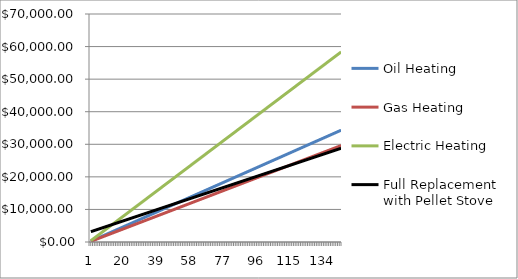
| Category | Oil Heating | Gas Heating | Electric Heating | Full Replacement with Pellet Stove |
|---|---|---|---|---|
| 0 | 240.01 | 207.04 | 408.04 | 3180.33 |
| 1 | 480.02 | 414.08 | 816.08 | 3360.66 |
| 2 | 720.03 | 621.12 | 1224.12 | 3540.99 |
| 3 | 960.04 | 828.16 | 1632.16 | 3721.32 |
| 4 | 1200.05 | 1035.2 | 2040.2 | 3901.65 |
| 5 | 1440.06 | 1242.24 | 2448.24 | 4081.98 |
| 6 | 1680.07 | 1449.28 | 2856.28 | 4262.31 |
| 7 | 1920.08 | 1656.32 | 3264.32 | 4442.64 |
| 8 | 2160.09 | 1863.36 | 3672.36 | 4622.97 |
| 9 | 2400.1 | 2070.4 | 4080.4 | 4803.3 |
| 10 | 2640.11 | 2277.44 | 4488.44 | 4983.63 |
| 11 | 2880.12 | 2484.48 | 4896.48 | 5163.96 |
| 12 | 3120.13 | 2691.52 | 5304.52 | 5344.29 |
| 13 | 3360.14 | 2898.56 | 5712.56 | 5524.62 |
| 14 | 3600.15 | 3105.6 | 6120.6 | 5704.95 |
| 15 | 3840.16 | 3312.64 | 6528.64 | 5885.28 |
| 16 | 4080.17 | 3519.68 | 6936.68 | 6065.61 |
| 17 | 4320.18 | 3726.72 | 7344.72 | 6245.94 |
| 18 | 4560.19 | 3933.76 | 7752.76 | 6426.27 |
| 19 | 4800.2 | 4140.8 | 8160.8 | 6606.6 |
| 20 | 5040.21 | 4347.84 | 8568.84 | 6786.93 |
| 21 | 5280.22 | 4554.88 | 8976.88 | 6967.26 |
| 22 | 5520.23 | 4761.92 | 9384.92 | 7147.59 |
| 23 | 5760.24 | 4968.96 | 9792.96 | 7327.92 |
| 24 | 6000.25 | 5176 | 10201 | 7508.25 |
| 25 | 6240.26 | 5383.04 | 10609.04 | 7688.58 |
| 26 | 6480.27 | 5590.08 | 11017.08 | 7868.91 |
| 27 | 6720.28 | 5797.12 | 11425.12 | 8049.24 |
| 28 | 6960.29 | 6004.16 | 11833.16 | 8229.57 |
| 29 | 7200.3 | 6211.2 | 12241.2 | 8409.9 |
| 30 | 7440.31 | 6418.24 | 12649.24 | 8590.23 |
| 31 | 7680.32 | 6625.28 | 13057.28 | 8770.56 |
| 32 | 7920.33 | 6832.32 | 13465.32 | 8950.89 |
| 33 | 8160.34 | 7039.36 | 13873.36 | 9131.22 |
| 34 | 8400.35 | 7246.4 | 14281.4 | 9311.55 |
| 35 | 8640.36 | 7453.44 | 14689.44 | 9491.88 |
| 36 | 8880.37 | 7660.48 | 15097.48 | 9672.21 |
| 37 | 9120.38 | 7867.52 | 15505.52 | 9852.54 |
| 38 | 9360.39 | 8074.56 | 15913.56 | 10032.87 |
| 39 | 9600.4 | 8281.6 | 16321.6 | 10213.2 |
| 40 | 9840.41 | 8488.64 | 16729.64 | 10393.53 |
| 41 | 10080.42 | 8695.68 | 17137.68 | 10573.86 |
| 42 | 10320.43 | 8902.72 | 17545.72 | 10754.19 |
| 43 | 10560.44 | 9109.76 | 17953.76 | 10934.52 |
| 44 | 10800.45 | 9316.8 | 18361.8 | 11114.85 |
| 45 | 11040.46 | 9523.84 | 18769.84 | 11295.18 |
| 46 | 11280.47 | 9730.88 | 19177.88 | 11475.51 |
| 47 | 11520.48 | 9937.92 | 19585.92 | 11655.84 |
| 48 | 11760.49 | 10144.96 | 19993.96 | 11836.17 |
| 49 | 12000.5 | 10352 | 20402 | 12016.5 |
| 50 | 12240.51 | 10559.04 | 20810.04 | 12196.83 |
| 51 | 12480.52 | 10766.08 | 21218.08 | 12377.16 |
| 52 | 12720.53 | 10973.12 | 21626.12 | 12557.49 |
| 53 | 12960.54 | 11180.16 | 22034.16 | 12737.82 |
| 54 | 13200.55 | 11387.2 | 22442.2 | 12918.15 |
| 55 | 13440.56 | 11594.24 | 22850.24 | 13098.48 |
| 56 | 13680.57 | 11801.28 | 23258.28 | 13278.81 |
| 57 | 13920.58 | 12008.32 | 23666.32 | 13459.14 |
| 58 | 14160.59 | 12215.36 | 24074.36 | 13639.47 |
| 59 | 14400.6 | 12422.4 | 24482.4 | 13819.8 |
| 60 | 14640.61 | 12629.44 | 24890.44 | 14000.13 |
| 61 | 14880.62 | 12836.48 | 25298.48 | 14180.46 |
| 62 | 15120.63 | 13043.52 | 25706.52 | 14360.79 |
| 63 | 15360.64 | 13250.56 | 26114.56 | 14541.12 |
| 64 | 15600.65 | 13457.6 | 26522.6 | 14721.45 |
| 65 | 15840.66 | 13664.64 | 26930.64 | 14901.78 |
| 66 | 16080.67 | 13871.68 | 27338.68 | 15082.11 |
| 67 | 16320.68 | 14078.72 | 27746.72 | 15262.44 |
| 68 | 16560.69 | 14285.76 | 28154.76 | 15442.77 |
| 69 | 16800.7 | 14492.8 | 28562.8 | 15623.1 |
| 70 | 17040.71 | 14699.84 | 28970.84 | 15803.43 |
| 71 | 17280.72 | 14906.88 | 29378.88 | 15983.76 |
| 72 | 17520.73 | 15113.92 | 29786.92 | 16164.09 |
| 73 | 17760.74 | 15320.96 | 30194.96 | 16344.42 |
| 74 | 18000.75 | 15528 | 30603 | 16524.75 |
| 75 | 18240.76 | 15735.04 | 31011.04 | 16705.08 |
| 76 | 18480.77 | 15942.08 | 31419.08 | 16885.41 |
| 77 | 18720.78 | 16149.12 | 31827.12 | 17065.74 |
| 78 | 18960.79 | 16356.16 | 32235.16 | 17246.07 |
| 79 | 19200.8 | 16563.2 | 32643.2 | 17426.4 |
| 80 | 19440.81 | 16770.24 | 33051.24 | 17606.73 |
| 81 | 19680.82 | 16977.28 | 33459.28 | 17787.06 |
| 82 | 19920.83 | 17184.32 | 33867.32 | 17967.39 |
| 83 | 20160.84 | 17391.36 | 34275.36 | 18147.72 |
| 84 | 20400.85 | 17598.4 | 34683.4 | 18328.05 |
| 85 | 20640.86 | 17805.44 | 35091.44 | 18508.38 |
| 86 | 20880.87 | 18012.48 | 35499.48 | 18688.71 |
| 87 | 21120.88 | 18219.52 | 35907.52 | 18869.04 |
| 88 | 21360.89 | 18426.56 | 36315.56 | 19049.37 |
| 89 | 21600.9 | 18633.6 | 36723.6 | 19229.7 |
| 90 | 21840.91 | 18840.64 | 37131.64 | 19410.03 |
| 91 | 22080.92 | 19047.68 | 37539.68 | 19590.36 |
| 92 | 22320.93 | 19254.72 | 37947.72 | 19770.69 |
| 93 | 22560.94 | 19461.76 | 38355.76 | 19951.02 |
| 94 | 22800.95 | 19668.8 | 38763.8 | 20131.35 |
| 95 | 23040.96 | 19875.84 | 39171.84 | 20311.68 |
| 96 | 23280.97 | 20082.88 | 39579.88 | 20492.01 |
| 97 | 23520.98 | 20289.92 | 39987.92 | 20672.34 |
| 98 | 23760.99 | 20496.96 | 40395.96 | 20852.67 |
| 99 | 24001 | 20704 | 40804 | 21033 |
| 100 | 24241.01 | 20911.04 | 41212.04 | 21213.33 |
| 101 | 24481.02 | 21118.08 | 41620.08 | 21393.66 |
| 102 | 24721.03 | 21325.12 | 42028.12 | 21573.99 |
| 103 | 24961.04 | 21532.16 | 42436.16 | 21754.32 |
| 104 | 25201.05 | 21739.2 | 42844.2 | 21934.65 |
| 105 | 25441.06 | 21946.24 | 43252.24 | 22114.98 |
| 106 | 25681.07 | 22153.28 | 43660.28 | 22295.31 |
| 107 | 25921.08 | 22360.32 | 44068.32 | 22475.64 |
| 108 | 26161.09 | 22567.36 | 44476.36 | 22655.97 |
| 109 | 26401.1 | 22774.4 | 44884.4 | 22836.3 |
| 110 | 26641.11 | 22981.44 | 45292.44 | 23016.63 |
| 111 | 26881.12 | 23188.48 | 45700.48 | 23196.96 |
| 112 | 27121.13 | 23395.52 | 46108.52 | 23377.29 |
| 113 | 27361.14 | 23602.56 | 46516.56 | 23557.62 |
| 114 | 27601.15 | 23809.6 | 46924.6 | 23737.95 |
| 115 | 27841.16 | 24016.64 | 47332.64 | 23918.28 |
| 116 | 28081.17 | 24223.68 | 47740.68 | 24098.61 |
| 117 | 28321.18 | 24430.72 | 48148.72 | 24278.94 |
| 118 | 28561.19 | 24637.76 | 48556.76 | 24459.27 |
| 119 | 28801.2 | 24844.8 | 48964.8 | 24639.6 |
| 120 | 29041.21 | 25051.84 | 49372.84 | 24819.93 |
| 121 | 29281.22 | 25258.88 | 49780.88 | 25000.26 |
| 122 | 29521.23 | 25465.92 | 50188.92 | 25180.59 |
| 123 | 29761.24 | 25672.96 | 50596.96 | 25360.92 |
| 124 | 30001.25 | 25880 | 51005 | 25541.25 |
| 125 | 30241.26 | 26087.04 | 51413.04 | 25721.58 |
| 126 | 30481.27 | 26294.08 | 51821.08 | 25901.91 |
| 127 | 30721.28 | 26501.12 | 52229.12 | 26082.24 |
| 128 | 30961.29 | 26708.16 | 52637.16 | 26262.57 |
| 129 | 31201.3 | 26915.2 | 53045.2 | 26442.9 |
| 130 | 31441.31 | 27122.24 | 53453.24 | 26623.23 |
| 131 | 31681.32 | 27329.28 | 53861.28 | 26803.56 |
| 132 | 31921.33 | 27536.32 | 54269.32 | 26983.89 |
| 133 | 32161.34 | 27743.36 | 54677.36 | 27164.22 |
| 134 | 32401.35 | 27950.4 | 55085.4 | 27344.55 |
| 135 | 32641.36 | 28157.44 | 55493.44 | 27524.88 |
| 136 | 32881.37 | 28364.48 | 55901.48 | 27705.21 |
| 137 | 33121.38 | 28571.52 | 56309.52 | 27885.54 |
| 138 | 33361.39 | 28778.56 | 56717.56 | 28065.87 |
| 139 | 33601.4 | 28985.6 | 57125.6 | 28246.2 |
| 140 | 33841.41 | 29192.64 | 57533.64 | 28426.53 |
| 141 | 34081.42 | 29399.68 | 57941.68 | 28606.86 |
| 142 | 34321.43 | 29606.72 | 58349.72 | 28787.19 |